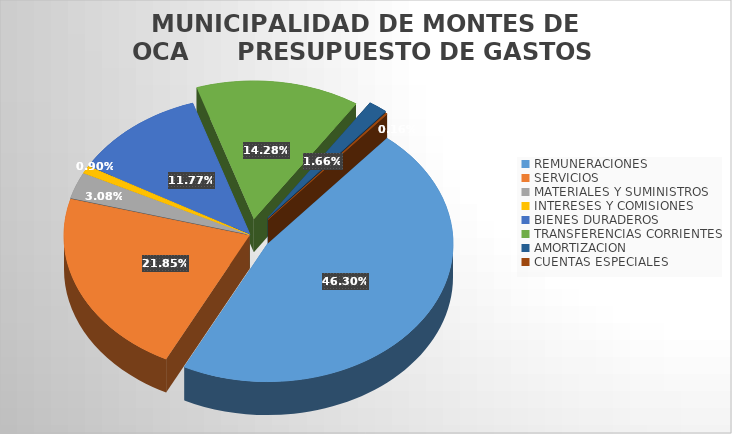
| Category | Series 0 |
|---|---|
| REMUNERACIONES | 3423378962.788 |
| SERVICIOS  | 1615813082.92 |
| MATERIALES Y SUMINISTROS | 227581439.35 |
| INTERESES Y COMISIONES  | 66907612.64 |
| BIENES DURADEROS | 870113150.89 |
| TRANSFERENCIAS CORRIENTES | 1055767372.093 |
| AMORTIZACION  | 122676578.67 |
| CUENTAS ESPECIALES | 11884575.29 |